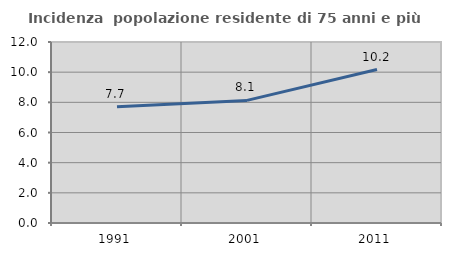
| Category | Incidenza  popolazione residente di 75 anni e più |
|---|---|
| 1991.0 | 7.702 |
| 2001.0 | 8.129 |
| 2011.0 | 10.176 |